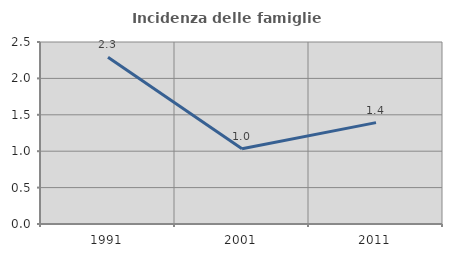
| Category | Incidenza delle famiglie numerose |
|---|---|
| 1991.0 | 2.292 |
| 2001.0 | 1.034 |
| 2011.0 | 1.393 |